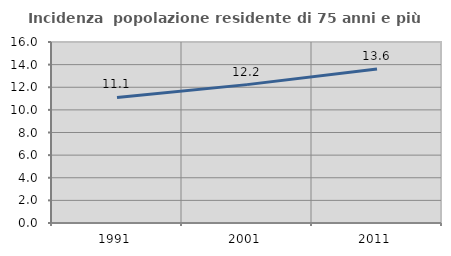
| Category | Incidenza  popolazione residente di 75 anni e più |
|---|---|
| 1991.0 | 11.098 |
| 2001.0 | 12.232 |
| 2011.0 | 13.622 |